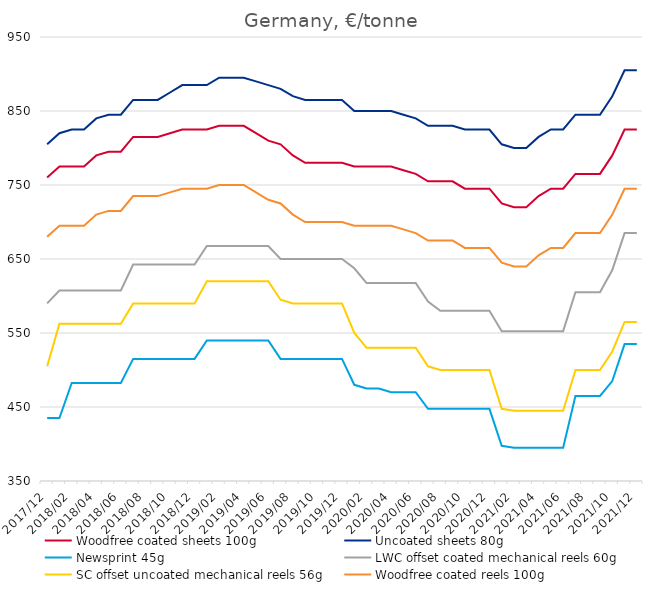
| Category | Woodfree coated sheets 100g | Uncoated sheets 80g | Newsprint 45g | LWC offset coated mechanical reels 60g | SC offset uncoated mechanical reels 56g | Woodfree coated reels 100g |
|---|---|---|---|---|---|---|
| 2017/12 | 760 | 805 | 435 | 590 | 505 | 680 |
| 2018/01 | 775 | 820 | 435 | 607.5 | 562.5 | 695 |
| 2018/02 | 775 | 825 | 482.5 | 607.5 | 562.5 | 695 |
| 2018/03 | 775 | 825 | 482.5 | 607.5 | 562.5 | 695 |
| 2018/04 | 790 | 840 | 482.5 | 607.5 | 562.5 | 710 |
| 2018/05 | 795 | 845 | 482.5 | 607.5 | 562.5 | 715 |
| 2018/06 | 795 | 845 | 482.5 | 607.5 | 562.5 | 715 |
| 2018/07 | 815 | 865 | 515 | 642.5 | 590 | 735 |
| 2018/08 | 815 | 865 | 515 | 642.5 | 590 | 735 |
| 2018/09 | 815 | 865 | 515 | 642.5 | 590 | 735 |
| 2018/10 | 820 | 875 | 515 | 642.5 | 590 | 740 |
| 2018/11 | 825 | 885 | 515 | 642.5 | 590 | 745 |
| 2018/12 | 825 | 885 | 515 | 642.5 | 590 | 745 |
| 2019/01 | 825 | 885 | 540 | 667.5 | 620 | 745 |
| 2019/02 | 830 | 895 | 540 | 667.5 | 620 | 750 |
| 2019/03 | 830 | 895 | 540 | 667.5 | 620 | 750 |
| 2019/04 | 830 | 895 | 540 | 667.5 | 620 | 750 |
| 2019/05 | 820 | 890 | 540 | 667.5 | 620 | 740 |
| 2019/06 | 810 | 885 | 540 | 667.5 | 620 | 730 |
| 2019/07 | 805 | 880 | 515 | 650 | 595 | 725 |
| 2019/08 | 790 | 870 | 515 | 650 | 590 | 710 |
| 2019/09 | 780 | 865 | 515 | 650 | 590 | 700 |
| 2019/10 | 780 | 865 | 515 | 650 | 590 | 700 |
| 2019/11 | 780 | 865 | 515 | 650 | 590 | 700 |
| 2019/12 | 780 | 865 | 515 | 650 | 590 | 700 |
| 2020/01 | 775 | 850 | 480 | 637.5 | 550 | 695 |
| 2020/02 | 775 | 850 | 475 | 617.5 | 530 | 695 |
| 2020/03 | 775 | 850 | 475 | 617.5 | 530 | 695 |
| 2020/04 | 775 | 850 | 470 | 617.5 | 530 | 695 |
| 2020/05 | 770 | 845 | 470 | 617.5 | 530 | 690 |
| 2020/06 | 765 | 840 | 470 | 617.5 | 530 | 685 |
| 2020/07 | 755 | 830 | 447.5 | 592.5 | 505 | 675 |
| 2020/08 | 755 | 830 | 447.5 | 580 | 500 | 675 |
| 2020/09 | 755 | 830 | 447.5 | 580 | 500 | 675 |
| 2020/10 | 745 | 825 | 447.5 | 580 | 500 | 665 |
| 2020/11 | 745 | 825 | 447.5 | 580 | 500 | 665 |
| 2020/12 | 745 | 825 | 447.5 | 580 | 500 | 665 |
| 2021/01 | 725 | 805 | 397.5 | 552.5 | 447.5 | 645 |
| 2021/02 | 720 | 800 | 395 | 552.5 | 445 | 640 |
| 2021/03 | 720 | 800 | 395 | 552.5 | 445 | 640 |
| 2021/04 | 735 | 815 | 395 | 552.5 | 445 | 655 |
| 2021/05 | 745 | 825 | 395 | 552.5 | 445 | 665 |
| 2021/06 | 745 | 825 | 395 | 552.5 | 445 | 665 |
| 2021/07 | 765 | 845 | 465 | 605 | 500 | 685 |
| 2021/08 | 765 | 845 | 465 | 605 | 500 | 685 |
| 2021/09 | 765 | 845 | 465 | 605 | 500 | 685 |
| 2021/10 | 790 | 870 | 485 | 635 | 525 | 710 |
| 2021/11 | 825 | 905 | 535 | 685 | 565 | 745 |
| 2021/12 | 825 | 905 | 535 | 685 | 565 | 745 |